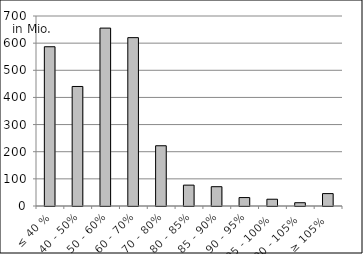
| Category | Volumen |
|---|---|
| ≤ 40 % | 586738624.642 |
| 40 - 50% | 440353055.478 |
| 50 - 60% | 655434015.26 |
| 60 - 70% | 620254526.844 |
| 70 - 80% | 221933966.098 |
| 80 - 85% | 76861248.236 |
| 85 - 90% | 71104069.535 |
| 90 - 95% | 31034474.399 |
| 95 - 100% | 24930168.389 |
| 100 - 105% | 12066771.04 |
| ≥ 105% | 45676806.551 |